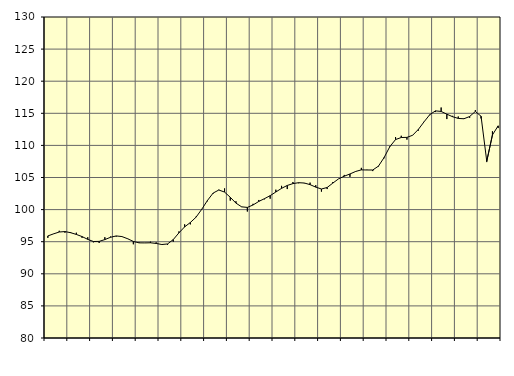
| Category | Piggar | Samtliga fast anställda (inkl. fast anställda utomlands) |
|---|---|---|
| nan | 95.6 | 95.9 |
| 1.0 | 96.2 | 96.22 |
| 1.0 | 96.7 | 96.51 |
| 1.0 | 96.4 | 96.58 |
| nan | 96.5 | 96.4 |
| 2.0 | 96.4 | 96.13 |
| 2.0 | 95.6 | 95.8 |
| 2.0 | 95.7 | 95.36 |
| nan | 94.9 | 95.03 |
| 3.0 | 94.8 | 95.05 |
| 3.0 | 95.7 | 95.33 |
| 3.0 | 95.8 | 95.69 |
| nan | 95.8 | 95.9 |
| 4.0 | 95.8 | 95.8 |
| 4.0 | 95.5 | 95.46 |
| 4.0 | 94.6 | 95.04 |
| nan | 94.9 | 94.82 |
| 5.0 | 94.8 | 94.81 |
| 5.0 | 95 | 94.83 |
| 5.0 | 94.9 | 94.73 |
| nan | 94.6 | 94.56 |
| 6.0 | 94.5 | 94.65 |
| 6.0 | 95 | 95.33 |
| 6.0 | 96.6 | 96.38 |
| nan | 97.7 | 97.31 |
| 7.0 | 97.7 | 97.99 |
| 7.0 | 98.9 | 98.82 |
| 7.0 | 100.1 | 100.05 |
| nan | 101.3 | 101.42 |
| 8.0 | 102.5 | 102.58 |
| 8.0 | 103.1 | 103.05 |
| 8.0 | 103.3 | 102.73 |
| nan | 101.4 | 101.92 |
| 9.0 | 101.3 | 101.01 |
| 9.0 | 100.4 | 100.43 |
| 9.0 | 99.7 | 100.34 |
| nan | 100.9 | 100.72 |
| 10.0 | 101.5 | 101.27 |
| 10.0 | 101.6 | 101.7 |
| 10.0 | 101.7 | 102.17 |
| nan | 103.1 | 102.74 |
| 11.0 | 103.7 | 103.31 |
| 11.0 | 103.2 | 103.76 |
| 11.0 | 104.3 | 104.05 |
| nan | 104.1 | 104.19 |
| 12.0 | 104.1 | 104.14 |
| 12.0 | 104.2 | 103.89 |
| 12.0 | 103.8 | 103.5 |
| nan | 102.8 | 103.21 |
| 13.0 | 103.2 | 103.44 |
| 13.0 | 104.3 | 104.13 |
| 13.0 | 104.8 | 104.79 |
| nan | 105.4 | 105.2 |
| 14.0 | 105.1 | 105.55 |
| 14.0 | 105.9 | 105.94 |
| 14.0 | 106.5 | 106.19 |
| nan | 106.2 | 106.17 |
| 15.0 | 106 | 106.17 |
| 15.0 | 106.7 | 106.77 |
| 15.0 | 108 | 108.12 |
| nan | 109.9 | 109.81 |
| 16.0 | 111.3 | 110.91 |
| 16.0 | 111.5 | 111.23 |
| 16.0 | 110.9 | 111.25 |
| nan | 111.6 | 111.58 |
| 17.0 | 112.3 | 112.49 |
| 17.0 | 113.7 | 113.67 |
| 17.0 | 114.7 | 114.79 |
| nan | 115.2 | 115.38 |
| 18.0 | 115.9 | 115.29 |
| 18.0 | 114.1 | 114.86 |
| 18.0 | 114.6 | 114.47 |
| nan | 114.5 | 114.2 |
| 19.0 | 114.2 | 114.15 |
| 19.0 | 114.3 | 114.5 |
| 19.0 | 115.5 | 115.29 |
| nan | 114.2 | 114.54 |
| 20.0 | 107.4 | 107.54 |
| 20.0 | 112.2 | 111.63 |
| 20.0 | 112.7 | 113.05 |